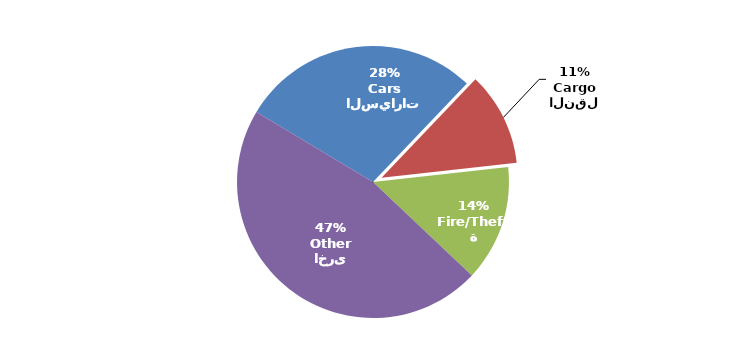
| Category | Series 0 |
|---|---|
| السيارات
Cars | 1521706 |
| النقل
Cargo | 593657 |
| الحريق/السرقة
Fire/Theft | 736724 |
| اخرى
Other | 2485151 |